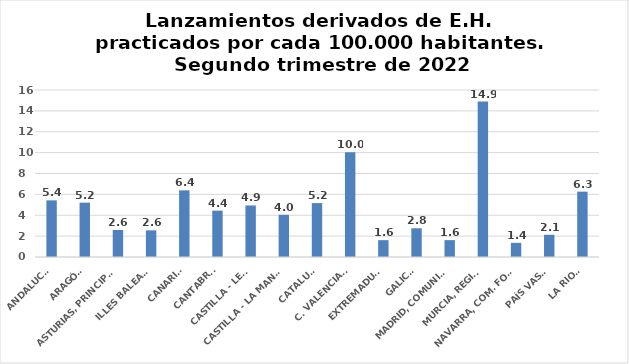
| Category | Series 0 |
|---|---|
| ANDALUCÍA | 5.426 |
| ARAGÓN | 5.206 |
| ASTURIAS, PRINCIPADO | 2.588 |
| ILLES BALEARS | 2.55 |
| CANARIAS | 6.387 |
| CANTABRIA | 4.443 |
| CASTILLA - LEÓN | 4.937 |
| CASTILLA - LA MANCHA | 4.044 |
| CATALUÑA | 5.165 |
| C. VALENCIANA | 10.038 |
| EXTREMADURA | 1.613 |
| GALICIA | 2.752 |
| MADRID, COMUNIDAD | 1.616 |
| MURCIA, REGIÓN | 14.888 |
| NAVARRA, COM. FORAL | 1.356 |
| PAÍS VASCO | 2.129 |
| LA RIOJA | 6.26 |